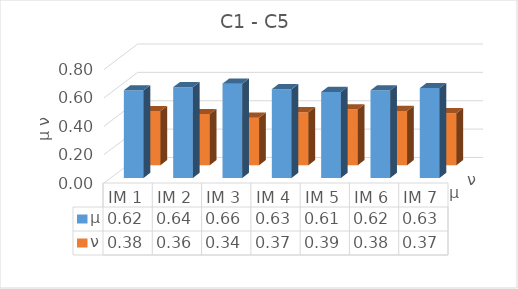
| Category | μ | ν |
|---|---|---|
| IM 1 | 0.618 | 0.382 |
| IM 2 | 0.64 | 0.36 |
| IM 3 | 0.665 | 0.335 |
| IM 4 | 0.626 | 0.374 |
| IM 5 | 0.606 | 0.394 |
| IM 6 | 0.618 | 0.382 |
| IM 7 | 0.634 | 0.366 |